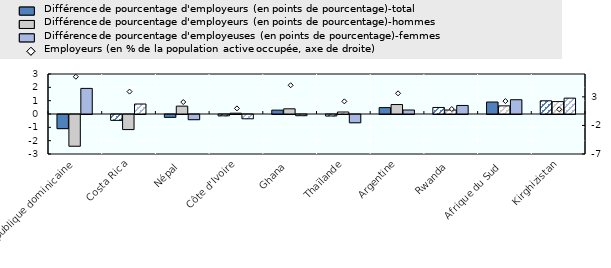
| Category | Différence de pourcentage d'employeurs (en points de pourcentage)-total | Différence de pourcentage d'employeurs (en points de pourcentage)-hommes | Différence de pourcentage d'employeuses (en points de pourcentage)-femmes |
|---|---|---|---|
| République dominicaine | -1.06 | -2.38 | 1.92 |
| Costa Rica | -0.44 | -1.13 | 0.75 |
| Népal | -0.21 | 0.59 | -0.39 |
| Côte d'Ivoire | -0.1 | 0.06 | -0.32 |
| Ghana | 0.29 | 0.39 | -0.09 |
| Thaïlande | -0.11 | 0.15 | -0.62 |
| Argentine | 0.48 | 0.71 | 0.3 |
| Rwanda | 0.49 | 0.3 | 0.64 |
| Afrique du Sud | 0.9 | 0.61 | 1.07 |
| Kirghizistan | 0.99 | 0.93 | 1.19 |